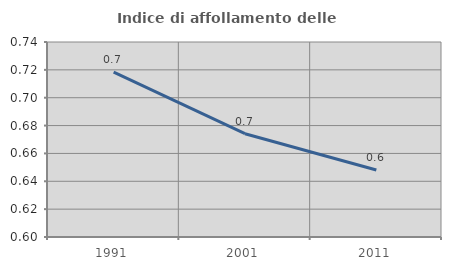
| Category | Indice di affollamento delle abitazioni  |
|---|---|
| 1991.0 | 0.718 |
| 2001.0 | 0.674 |
| 2011.0 | 0.648 |